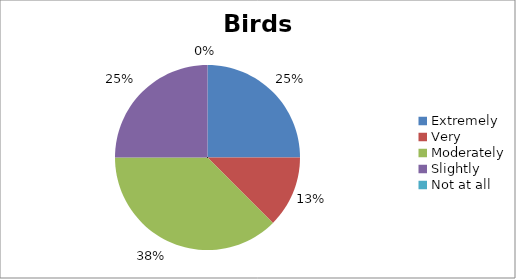
| Category | Birds |
|---|---|
| Extremely | 2 |
| Very | 1 |
| Moderately | 3 |
| Slightly | 2 |
| Not at all | 0 |